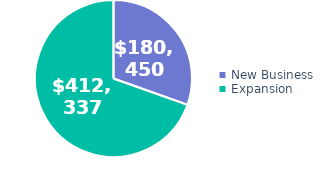
| Category | Series 0 |
|---|---|
| New Business | 180450 |
| Expansion | 412337 |